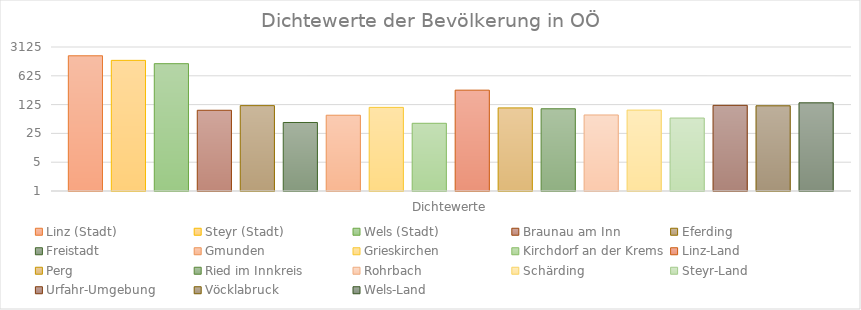
| Category | Linz (Stadt) | Steyr (Stadt) | Wels (Stadt) | Braunau am Inn | Eferding | Freistadt | Gmunden | Grieskirchen | Kirchdorf an der Krems | Linz-Land | Perg | Ried im Innkreis | Rohrbach | Schärding | Steyr-Land | Urfahr-Umgebung | Vöcklabruck | Wels-Land |
|---|---|---|---|---|---|---|---|---|---|---|---|---|---|---|---|---|---|---|
| Dichtewerte | 1912 | 1481 | 1230 | 91 | 118 | 46 | 69 | 107 | 44 | 280 | 104 | 99 | 70 | 92 | 59 | 120 | 117 | 138 |